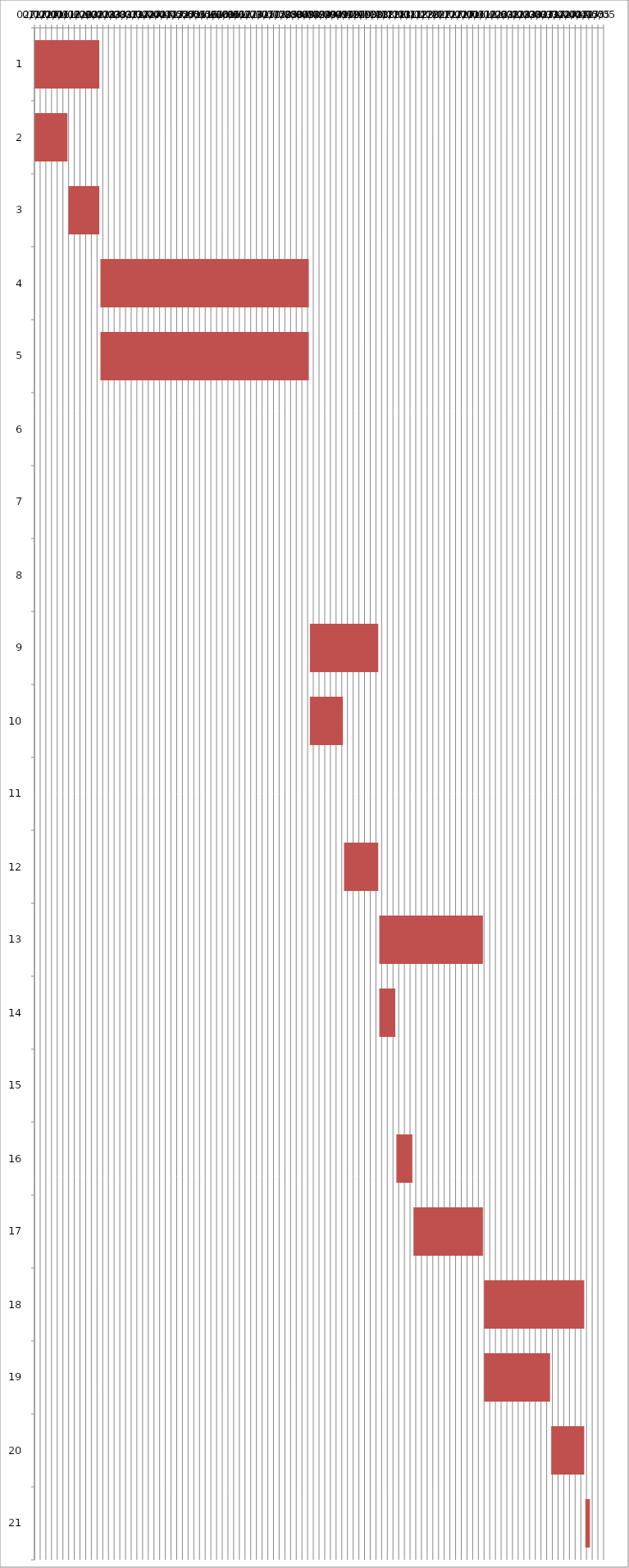
| Category | Fecha de inicio | DURACIÓN |
|---|---|---|
| 0 | 1/2/17 | 57 |
| 1 | 1/2/17 | 29 |
| 2 | 2/1/17 | 27 |
| 3 | 3/1/17 | 183 |
| 4 | 3/1/17 | 183 |
| 5 | 3/10/17 | 0 |
| 6 | 5/10/17 | 0 |
| 7 | 7/10/17 | 0 |
| 8 | 9/1/17 | 60 |
| 9 | 9/1/17 | 29 |
| 10 | 9/10/17 | 0 |
| 11 | 10/1/17 | 30 |
| 12 | 11/1/17 | 91 |
| 13 | 11/1/17 | 14 |
| 14 | 11/10/17 | 0 |
| 15 | 11/16/17 | 14 |
| 16 | 12/1/17 | 61 |
| 17 | 2/1/18 | 88 |
| 18 | 2/1/18 | 58 |
| 19 | 4/1/18 | 29 |
| 20 | 5/1/18 | 4 |